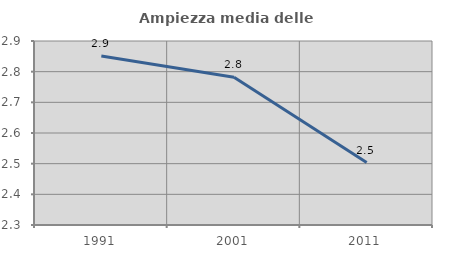
| Category | Ampiezza media delle famiglie |
|---|---|
| 1991.0 | 2.851 |
| 2001.0 | 2.782 |
| 2011.0 | 2.504 |